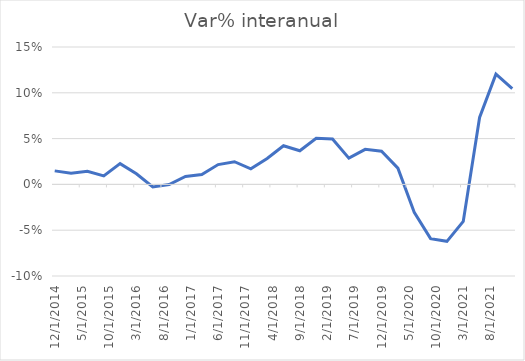
| Category | Series 0 |
|---|---|
| 12/20/14 | 0.015 |
| 3/20/15 | 0.012 |
| 6/18/15 | 0.014 |
| 9/16/15 | 0.009 |
| 12/15/15 | 0.023 |
| 3/14/16 | 0.012 |
| 6/12/16 | -0.003 |
| 9/10/16 | 0 |
| 12/9/16 | 0.009 |
| 3/9/17 | 0.011 |
| 6/7/17 | 0.022 |
| 9/5/17 | 0.025 |
| 12/4/17 | 0.017 |
| 3/30/18 | 0.028 |
| 6/28/18 | 0.042 |
| 9/26/18 | 0.037 |
| 12/25/18 | 0.05 |
| 3/25/19 | 0.05 |
| 6/23/19 | 0.029 |
| 9/21/19 | 0.038 |
| 12/20/19 | 0.036 |
| 3/19/20 | 0.018 |
| 6/17/20 | -0.031 |
| 9/15/20 | -0.059 |
| 12/14/20 | -0.062 |
| 3/14/21 | -0.04 |
| 6/12/21 | 0.073 |
| 9/10/21 | 0.12 |
| 12/9/21 | 0.105 |